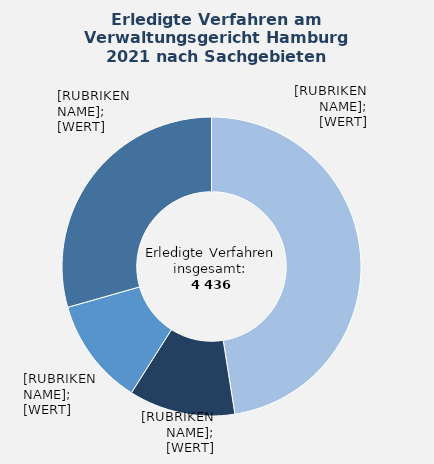
| Category | in Prozent |
|---|---|
| Asylrecht – Hauptsacheverfahren (Asylrecht, Verteilung von Asylbewerbenden) | 47.5 |
| Ausländerrecht | 11.5 |
| Recht des öffentlichen Dienstes | 11.6 |
| Übrige Sachgebiete¹ | 29.4 |